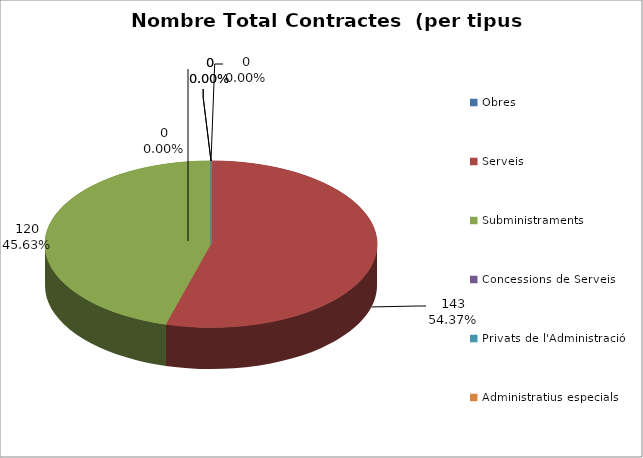
| Category | Nombre Total Contractes |
|---|---|
| Obres | 0 |
| Serveis | 143 |
| Subministraments | 120 |
| Concessions de Serveis | 0 |
| Privats de l'Administració | 0 |
| Administratius especials | 0 |